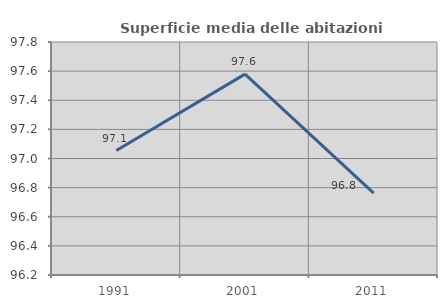
| Category | Superficie media delle abitazioni occupate |
|---|---|
| 1991.0 | 97.055 |
| 2001.0 | 97.579 |
| 2011.0 | 96.762 |